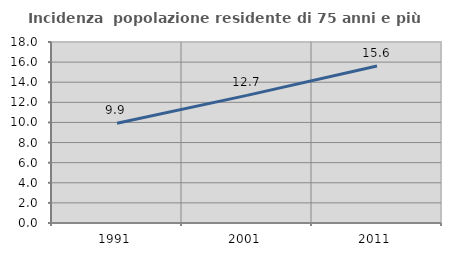
| Category | Incidenza  popolazione residente di 75 anni e più |
|---|---|
| 1991.0 | 9.915 |
| 2001.0 | 12.693 |
| 2011.0 | 15.615 |